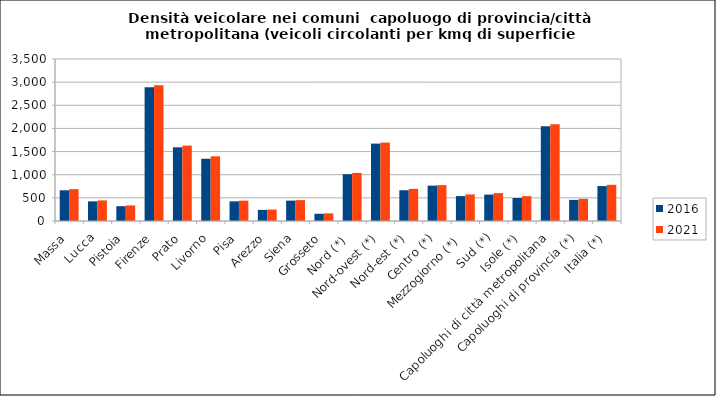
| Category | 2016 | 2021 |
|---|---|---|
| Massa | 663 | 688 |
| Lucca | 424 | 445 |
| Pistoia | 320 | 336 |
| Firenze | 2892 | 2932 |
| Prato | 1592 | 1629 |
| Livorno | 1345 | 1397 |
| Pisa | 425 | 440 |
| Arezzo | 240 | 247 |
| Siena | 440 | 451 |
| Grosseto | 156 | 165 |
| Nord (*)  | 1011 | 1038 |
| Nord-ovest (*) | 1672 | 1695 |
| Nord-est (*) | 664 | 694 |
| Centro (*) | 764 | 775 |
| Mezzogiorno (*)  | 538 | 574 |
| Sud (*) | 571 | 602 |
| Isole (*) | 497 | 536 |
| Capoluoghi di città metropolitana | 2047 | 2089 |
| Capoluoghi di provincia (*) | 456 | 479 |
| Italia (*) | 755 | 782 |